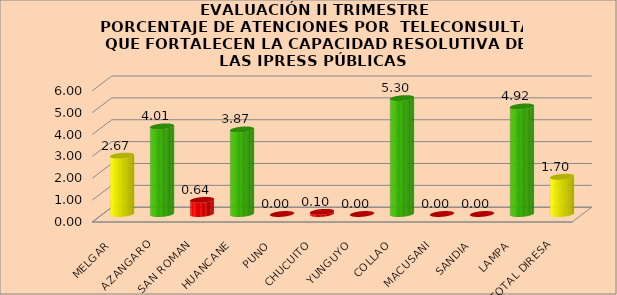
| Category | ATENDIDOS |
|---|---|
| MELGAR | 2.671 |
| AZANGARO | 4.006 |
| SAN ROMAN | 0.644 |
| HUANCANE | 3.865 |
| PUNO | 0 |
| CHUCUITO | 0.099 |
| YUNGUYO | 0 |
| COLLAO | 5.299 |
| MACUSANI | 0 |
| SANDIA | 0 |
| LAMPA | 4.918 |
| TOTAL DIRESA | 1.703 |